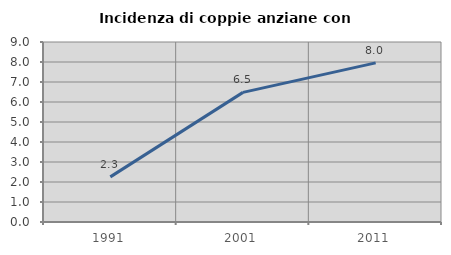
| Category | Incidenza di coppie anziane con figli |
|---|---|
| 1991.0 | 2.256 |
| 2001.0 | 6.481 |
| 2011.0 | 7.955 |